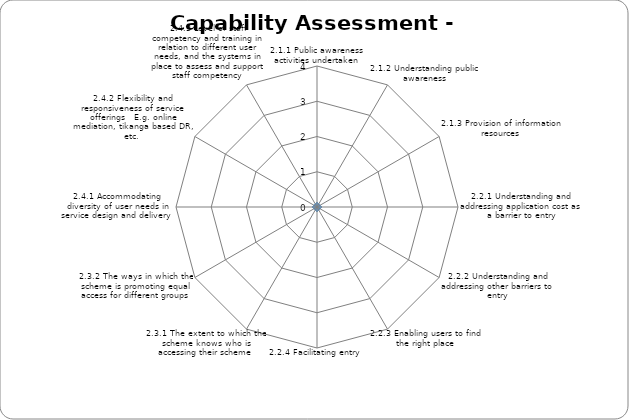
| Category | Series 0 |
|---|---|
| 2.1.1 Public awareness activities undertaken | 0 |
| 2.1.2 Understanding public awareness | 0 |
| 2.1.3 Provision of information resources | 0 |
| 2.2.1 Understanding and addressing application cost as a barrier to entry | 0 |
| 2.2.2 Understanding and addressing other barriers to entry | 0 |
| 2.2.3 Enabling users to find the right place | 0 |
| 2.2.4 Facilitating entry | 0 |
| 2.3.1 The extent to which the scheme knows who is accessing their scheme | 0 |
| 2.3.2 The ways in which the scheme is promoting equal access for different groups  | 0 |
| 2.4.1 Accommodating diversity of user needs in service design and delivery  | 0 |
| 2.4.2 Flexibility and responsiveness of service offerings   E.g. online mediation, tikanga based DR, etc.  | 0 |
| 2.4.3 Level of staff competency and training in relation to different user needs, and the systems in place to assess and support staff competency | 0 |